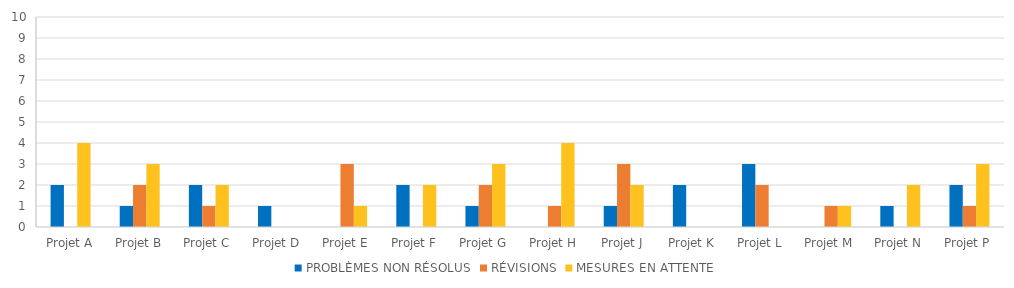
| Category | PROBLÈMES NON RÉSOLUS | RÉVISIONS | MESURES EN ATTENTE |
|---|---|---|---|
| Projet A | 2 | 0 | 4 |
| Projet B | 1 | 2 | 3 |
| Projet C | 2 | 1 | 2 |
| Projet D | 1 | 0 | 0 |
| Projet E | 0 | 3 | 1 |
| Projet F | 2 | 0 | 2 |
| Projet G | 1 | 2 | 3 |
| Projet H | 0 | 1 | 4 |
| Projet J | 1 | 3 | 2 |
| Projet K | 2 | 0 | 0 |
| Projet L | 3 | 2 | 0 |
| Projet M | 0 | 1 | 1 |
| Projet N | 1 | 0 | 2 |
| Projet P | 2 | 1 | 3 |